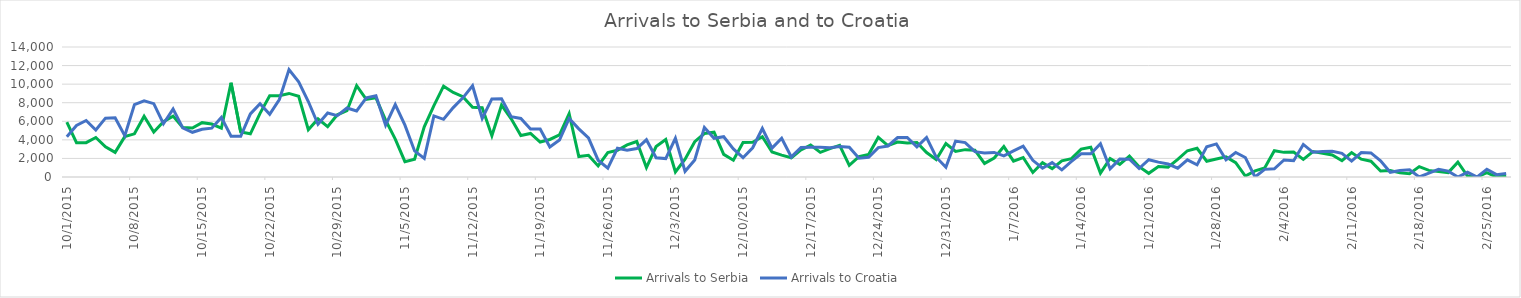
| Category | Arrivals to Serbia | Arrivals to Croatia |
|---|---|---|
| 10/1/15 | 5900 | 4344 |
| 10/2/15 | 3700 | 5546 |
| 10/3/15 | 3700 | 6086 |
| 10/4/15 | 4250 | 5065 |
| 10/5/15 | 3250 | 6338 |
| 10/6/15 | 2650 | 6370 |
| 10/7/15 | 4350 | 4446 |
| 10/8/15 | 4650 | 7798 |
| 10/9/15 | 6550 | 8201 |
| 10/10/15 | 4850 | 7896 |
| 10/11/15 | 5950 | 5732 |
| 10/12/15 | 6556 | 7317 |
| 10/13/15 | 5330 | 5286 |
| 10/14/15 | 5280 | 4814 |
| 10/15/15 | 5850 | 5138 |
| 10/16/15 | 5700 | 5260 |
| 10/17/15 | 5250 | 6415 |
| 10/18/15 | 10150 | 4390 |
| 10/19/15 | 4850 | 4388 |
| 10/20/15 | 4650 | 6793 |
| 10/21/15 | 6850 | 7900 |
| 10/22/15 | 8750 | 6748 |
| 10/23/15 | 8750 | 8348 |
| 10/24/15 | 9000 | 11570 |
| 10/25/15 | 8700 | 10249 |
| 10/26/15 | 5100 | 8128 |
| 10/27/15 | 6257 | 5683 |
| 10/28/15 | 5415 | 6900 |
| 10/29/15 | 6700 | 6615 |
| 10/30/15 | 7138 | 7429 |
| 10/31/15 | 9834 | 7110 |
| 11/1/15 | 8354 | 8534 |
| 11/2/15 | 8521 | 8746 |
| 11/3/15 | 6129 | 5573 |
| 11/4/15 | 4073 | 7792 |
| 11/5/15 | 1652 | 5587 |
| 11/6/15 | 1906 | 2809 |
| 11/7/15 | 5397 | 2000 |
| 11/8/15 | 7695 | 6579 |
| 11/9/15 | 9785 | 6214 |
| 11/10/15 | 9107 | 7474 |
| 11/11/15 | 8648 | 8524 |
| 11/12/15 | 7500 | 9823 |
| 11/13/15 | 7464 | 6314 |
| 11/14/15 | 4453 | 8405 |
| 11/15/15 | 7734 | 8415 |
| 11/16/15 | 6267 | 6490 |
| 11/17/15 | 4460 | 6304 |
| 11/18/15 | 4694 | 5180 |
| 11/19/15 | 3765 | 5167 |
| 11/20/15 | 4042 | 3230 |
| 11/21/15 | 4527 | 3977 |
| 11/22/15 | 6826 | 6305 |
| 11/23/15 | 2201 | 5184 |
| 11/24/15 | 2335 | 4203 |
| 11/25/15 | 1194 | 1808 |
| 11/26/15 | 2636 | 952 |
| 11/27/15 | 2878 | 3095 |
| 11/28/15 | 3454 | 2886 |
| 11/29/15 | 3825 | 3060 |
| 11/30/15 | 1009 | 4009 |
| 12/1/15 | 3284 | 2066 |
| 12/2/15 | 4040 | 1982 |
| 12/3/15 | 553 | 4174 |
| 12/4/15 | 1927 | 611 |
| 12/5/15 | 3799 | 1835 |
| 12/6/15 | 4686 | 5339 |
| 12/7/15 | 4823 | 4162 |
| 12/8/15 | 2437 | 4335 |
| 12/9/15 | 1807 | 3027 |
| 12/10/15 | 3723 | 2076 |
| 12/11/15 | 3747 | 3149 |
| 12/12/15 | 4339 | 5225 |
| 12/13/15 | 2698 | 3112 |
| 12/14/15 | 2353 | 4174 |
| 12/15/15 | 2067 | 2160 |
| 12/16/15 | 2916 | 3177 |
| 12/17/15 | 3438 | 3192 |
| 12/18/15 | 2649 | 3200 |
| 12/19/15 | 3052 | 3156 |
| 12/20/15 | 3405 | 3276 |
| 12/21/15 | 1253 | 3210 |
| 12/22/15 | 2186 | 2027 |
| 12/23/15 | 2415 | 2116 |
| 12/24/15 | 4279 | 3166 |
| 12/25/15 | 3390 | 3339 |
| 12/26/15 | 3757 | 4241 |
| 12/27/15 | 3674 | 4251 |
| 12/28/15 | 3708 | 3249 |
| 12/29/15 | 2629 | 4253 |
| 12/30/15 | 1879 | 2132 |
| 12/31/15 | 3602 | 1058 |
| 1/1/16 | 2745 | 3869 |
| 1/2/16 | 2947 | 3710 |
| 1/3/16 | 2889 | 2732 |
| 1/4/16 | 1462 | 2591 |
| 1/5/16 | 2041 | 2650 |
| 1/6/16 | 3273 | 2273 |
| 1/7/16 | 1715 | 2814 |
| 1/8/16 | 2100 | 3332 |
| 1/9/16 | 489 | 1799 |
| 1/10/16 | 1538 | 942 |
| 1/11/16 | 905 | 1549 |
| 1/12/16 | 1743 | 769 |
| 1/13/16 | 1973 | 1679 |
| 1/14/16 | 3006 | 2502 |
| 1/15/16 | 3213 | 2493 |
| 1/16/16 | 415 | 3579 |
| 1/17/16 | 1995 | 878 |
| 1/18/16 | 1362 | 1930 |
| 1/19/16 | 2244 | 1917 |
| 1/20/16 | 1113 | 914 |
| 1/21/16 | 397 | 1865 |
| 1/22/16 | 1134 | 1599 |
| 1/23/16 | 1064 | 1394 |
| 1/24/16 | 1895 | 946 |
| 1/25/16 | 2827 | 1847 |
| 1/26/16 | 3091 | 1309 |
| 1/27/16 | 1695 | 3256 |
| 1/28/16 | 1940 | 3565 |
| 1/29/16 | 2167 | 1843 |
| 1/30/16 | 1540 | 2641 |
| 1/31/16 | 103 | 2098 |
| 2/1/16 | 660 | 0 |
| 2/2/16 | 966 | 822 |
| 2/3/16 | 2825 | 881 |
| 2/4/16 | 2653 | 1836 |
| 2/5/16 | 2694 | 1750 |
| 2/6/16 | 1901 | 3510 |
| 2/7/16 | 2739 | 2658 |
| 2/8/16 | 2563 | 2736 |
| 2/9/16 | 2379 | 2764 |
| 2/10/16 | 1758 | 2544 |
| 2/11/16 | 2636 | 1716 |
| 2/12/16 | 1923 | 2635 |
| 2/13/16 | 1699 | 2595 |
| 2/14/16 | 641 | 1749 |
| 2/15/16 | 691 | 512 |
| 2/16/16 | 443 | 701 |
| 2/17/16 | 345 | 769 |
| 2/18/16 | 1117 | 0 |
| 2/19/16 | 713 | 408 |
| 2/20/16 | 580 | 834 |
| 2/21/16 | 476 | 630 |
| 2/22/16 | 1595 | 0 |
| 2/23/16 | 106 | 507 |
| 2/24/16 | 1 | 0 |
| 2/25/16 | 475 | 841 |
| 2/26/16 | 0 | 250 |
| 2/27/16 | 158 | 385 |